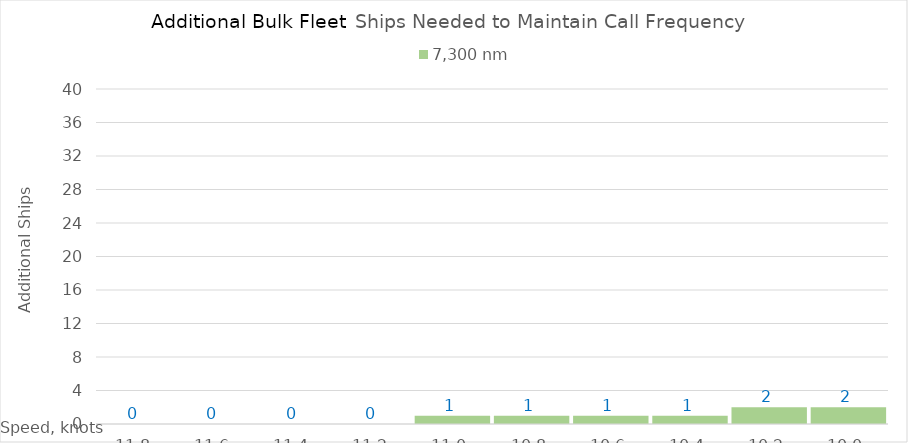
| Category | 7,300 |
|---|---|
| 11.8 | 0 |
| 11.600000000000001 | 0 |
| 11.400000000000002 | 0 |
| 11.200000000000003 | 0 |
| 11.000000000000004 | 1 |
| 10.800000000000004 | 1 |
| 10.600000000000005 | 1 |
| 10.400000000000006 | 1 |
| 10.200000000000006 | 2 |
| 10.000000000000007 | 2 |